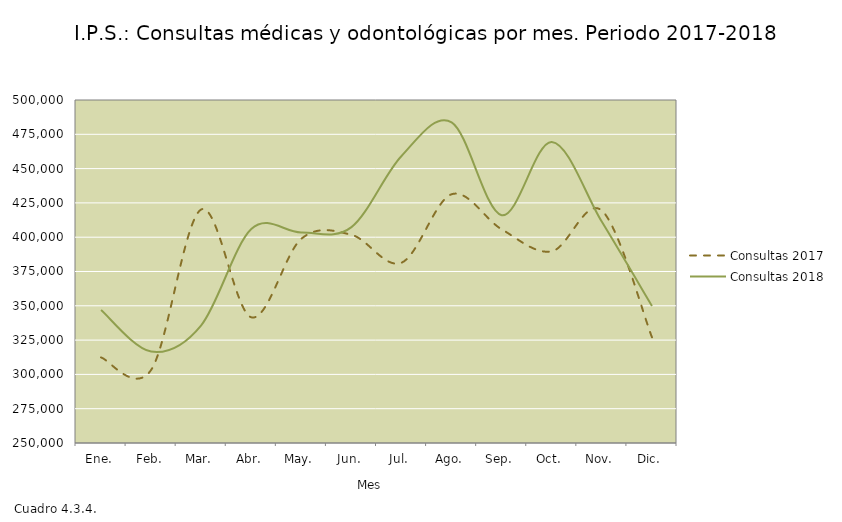
| Category | Consultas 2017 | Consultas 2018 |
|---|---|---|
| Ene. | 312381 | 346870 |
| Feb. | 303264 | 316657 |
| Mar. | 420211 | 335784 |
| Abr. | 341613 | 405925 |
| May. | 398878 | 403445 |
| Jun. | 401752 | 407342 |
| Jul. | 381407 | 459224 |
| Ago. | 431320 | 483767 |
| Sep. | 405726 | 416061 |
| Oct. | 389697 | 469428 |
| Nov. | 419390 | 411203 |
| Dic. | 327078 | 349912 |